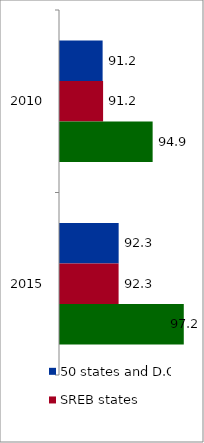
| Category | 50 states and D.C. | SREB states | State |
|---|---|---|---|
| 2010.0 | 91.157 | 91.192 | 94.862 |
| 2015.0 | 92.345 | 92.341 | 97.169 |